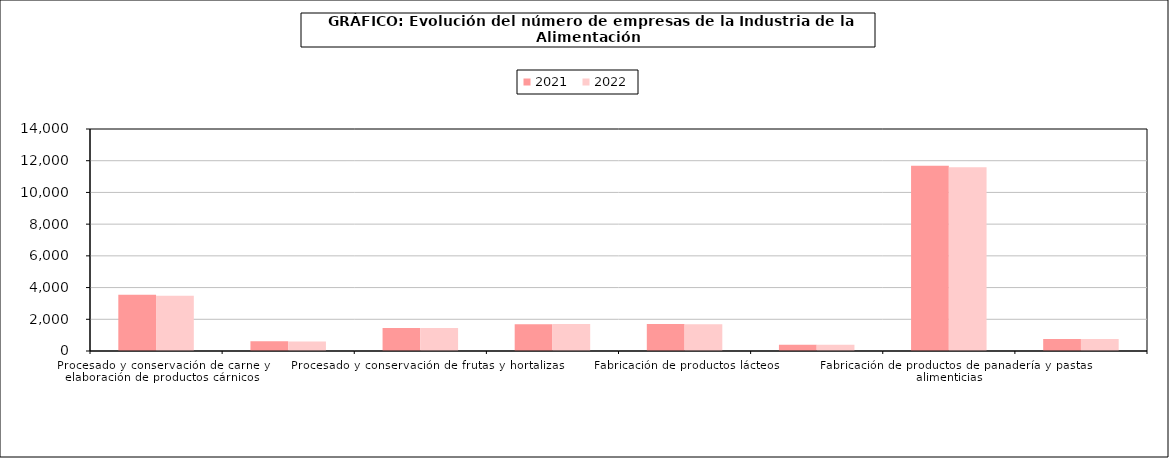
| Category | 2021 | 2022 |
|---|---|---|
| Procesado y conservación de carne y elaboración de productos cárnicos | 3554 | 3477 |
| Procesado y conservación de pescados, crustáceos y moluscos | 610 | 599 |
| Procesado y conservación de frutas y hortalizas | 1452 | 1445 |
| Fabricación de aceites y grasas vegetales y animales | 1689 | 1707 |
| Fabricación de productos lácteos | 1695 | 1694 |
| Fabricación de productos de molinería, almidones y productos amiláceos | 389 | 389 |
| Fabricación de productos de panadería y pastas alimenticias | 11676 | 11591 |
| Fabricación de productos para la alimentación animal | 764 | 759 |